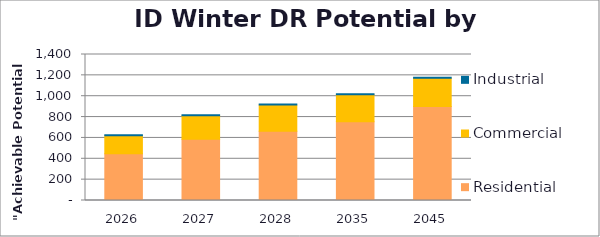
| Category | Residential | Commercial | Industrial |
|---|---|---|---|
| 2026.0 | 447.428 | 174.621 | 8.493 |
| 2027.0 | 587.088 | 225.56 | 8.496 |
| 2028.0 | 664.937 | 251.792 | 8.499 |
| 2035.0 | 754.648 | 260.134 | 8.523 |
| 2045.0 | 900.27 | 272.532 | 8.557 |